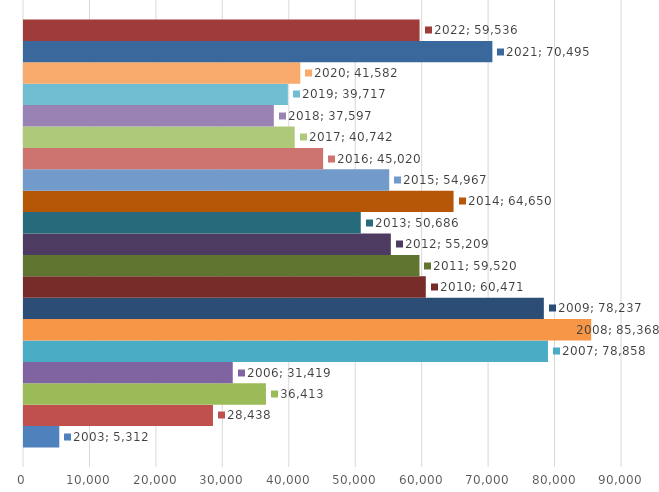
| Category | 2003 | 2004 | 2005 | 2006 | 2007 | 2008 | 2009 | 2010 | 2011 | 2012 | 2013 | 2014 | 2015 | 2016 | 2017 | 2018 | 2019 | 2020 | 2021 | 2022 |
|---|---|---|---|---|---|---|---|---|---|---|---|---|---|---|---|---|---|---|---|---|
| 0 | 5312 | 28438 | 36413 | 31419 | 78858 | 85368 | 78237 | 60471 | 59520 | 55209 | 50686 | 64650 | 54967 | 45020 | 40742 | 37597 | 39717 | 41582 | 70495 | 59536 |